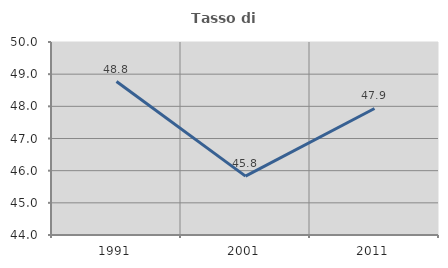
| Category | Tasso di occupazione   |
|---|---|
| 1991.0 | 48.771 |
| 2001.0 | 45.829 |
| 2011.0 | 47.934 |